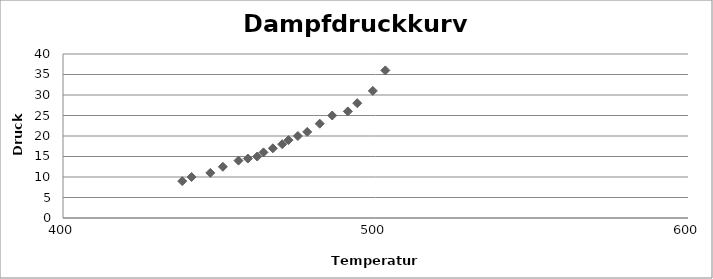
| Category | Series 0 |
|---|---|
| 503.15 | 36 |
| 499.15 | 31 |
| 494.15 | 28 |
| 491.15 | 26 |
| 486.15 | 25 |
| 482.15 | 23 |
| 478.15 | 21 |
| 475.15 | 20 |
| 472.15 | 19 |
| 470.15 | 18 |
| 467.15 | 17 |
| 464.15 | 16 |
| 462.15 | 15 |
| 459.15 | 14.5 |
| 456.15 | 14 |
| 451.15 | 12.5 |
| 447.15 | 11 |
| 441.15 | 10 |
| 438.15 | 9 |